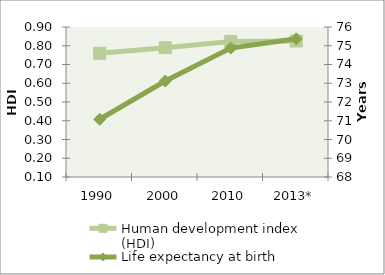
| Category | Human development index (HDI) |
|---|---|
| 1990 | 0.76 |
| 2000 | 0.79 |
| 2010 | 0.823 |
| 2013* | 0.825 |